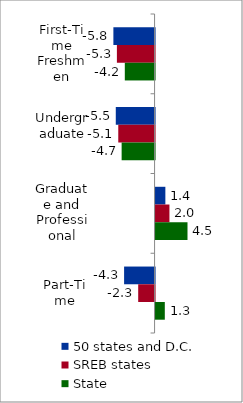
| Category | 50 states and D.C. | SREB states | State |
|---|---|---|---|
| First-Time Freshmen | -5.824 | -5.328 | -4.209 |
| Undergraduate | -5.485 | -5.133 | -4.658 |
| Graduate and Professional | 1.385 | 1.961 | 4.515 |
| Part-Time | -4.31 | -2.316 | 1.307 |